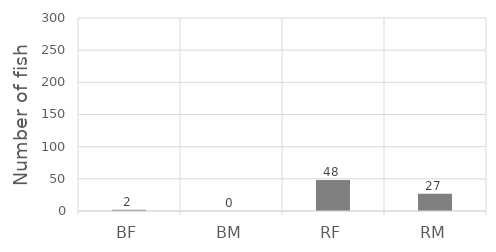
| Category | Series 0 |
|---|---|
| BF | 2 |
| BM | 0 |
| RF | 48 |
| RM | 27 |